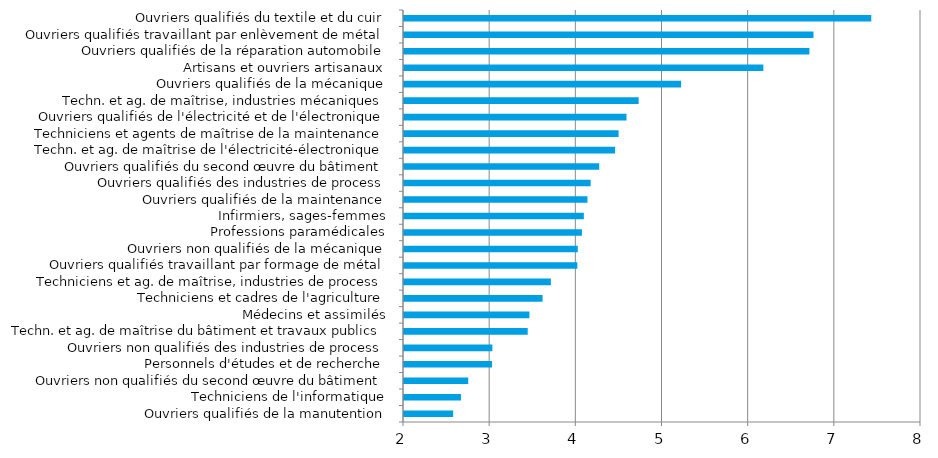
| Category | Series 0 |
|---|---|
| Ouvriers qualifiés de la manutention | 2.571 |
| Techniciens de l'informatique | 2.661 |
| Ouvriers non qualifiés du second œuvre du bâtiment | 2.745 |
| Personnels d'études et de recherche | 3.022 |
| Ouvriers non qualifiés des industries de process | 3.026 |
| Techn. et ag. de maîtrise du bâtiment et travaux publics | 3.436 |
| Médecins et assimilés | 3.456 |
| Techniciens et cadres de l'agriculture | 3.608 |
| Techniciens et ag. de maîtrise, industries de process | 3.704 |
| Ouvriers qualifiés travaillant par formage de métal | 4.012 |
| Ouvriers non qualifiés de la mécanique | 4.017 |
| Professions paramédicales | 4.065 |
| Infirmiers, sages-femmes | 4.087 |
| Ouvriers qualifiés de la maintenance | 4.129 |
| Ouvriers qualifiés des industries de process | 4.166 |
| Ouvriers qualifiés du second œuvre du bâtiment | 4.265 |
| Techn. et ag. de maîtrise de l'électricité-électronique | 4.45 |
| Techniciens et agents de maîtrise de la maintenance | 4.491 |
| Ouvriers qualifiés de l'électricité et de l'électronique | 4.582 |
| Techn. et ag. de maîtrise, industries mécaniques | 4.723 |
| Ouvriers qualifiés de la mécanique | 5.216 |
| Artisans et ouvriers artisanaux | 6.17 |
| Ouvriers qualifiés de la réparation automobile | 6.705 |
| Ouvriers qualifiés travaillant par enlèvement de métal | 6.752 |
| Ouvriers qualifiés du textile et du cuir | 7.423 |